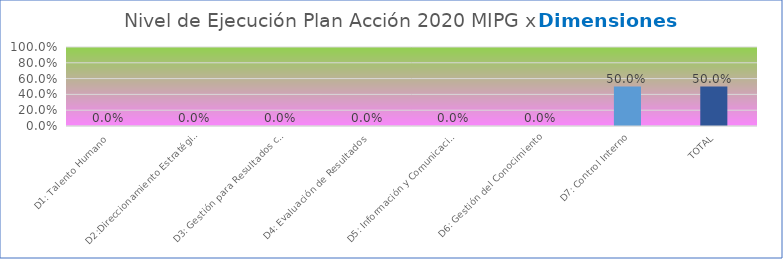
| Category | Series 0 |
|---|---|
| D1: Talento Humano | 0 |
| D2:Direccionamiento Estratégico y Planeación | 0 |
| D3: Gestión para Resultados con Valores | 0 |
| D4: Evaluación de Resultados | 0 |
| D5: Información y Comunicación | 0 |
| D6: Gestión del Conocimiento | 0 |
| D7: Control Interno | 0.5 |
| TOTAL | 0.5 |